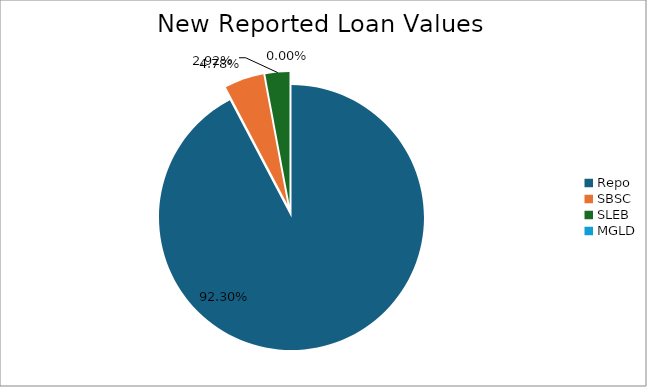
| Category | Series 0 |
|---|---|
| Repo | 13685080.862 |
| SBSC | 708369.093 |
| SLEB | 433599.063 |
| MGLD | 234.605 |